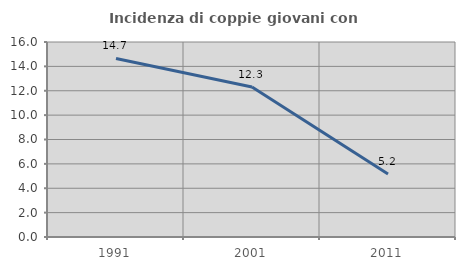
| Category | Incidenza di coppie giovani con figli |
|---|---|
| 1991.0 | 14.653 |
| 2001.0 | 12.312 |
| 2011.0 | 5.163 |